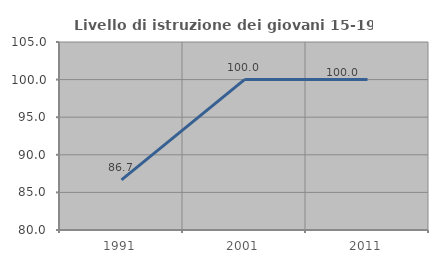
| Category | Livello di istruzione dei giovani 15-19 anni |
|---|---|
| 1991.0 | 86.667 |
| 2001.0 | 100 |
| 2011.0 | 100 |